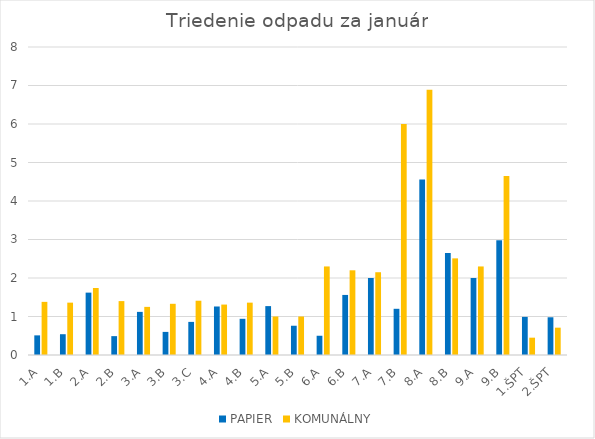
| Category | PAPIER | KOMUNÁLNY |
|---|---|---|
| 1.A | 0.51 | 1.38 |
| 1.B | 0.54 | 1.36 |
| 2.A | 1.62 | 1.74 |
| 2.B | 0.49 | 1.4 |
| 3.A | 1.12 | 1.25 |
| 3.B | 0.6 | 1.33 |
| 3.C | 0.86 | 1.41 |
| 4.A | 1.26 | 1.31 |
| 4.B | 0.94 | 1.36 |
| 5.A | 1.27 | 1 |
| 5.B | 0.76 | 1 |
| 6.A | 0.5 | 2.3 |
| 6.B | 1.56 | 2.2 |
| 7.A | 2 | 2.15 |
| 7.B | 1.2 | 6 |
| 8.A | 4.56 | 6.89 |
| 8.B | 2.65 | 2.51 |
| 9.A | 2 | 2.3 |
| 9.B | 2.98 | 4.65 |
| 1.ŠPT | 0.99 | 0.45 |
| 2.ŠPT | 0.98 | 0.71 |